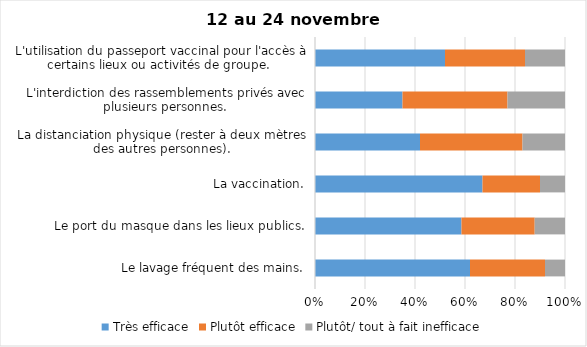
| Category | Très efficace | Plutôt efficace | Plutôt/ tout à fait inefficace |
|---|---|---|---|
| Le lavage fréquent des mains. | 62 | 30 | 8 |
| Le port du masque dans les lieux publics. | 58 | 29 | 12 |
| La vaccination. | 67 | 23 | 10 |
| La distanciation physique (rester à deux mètres des autres personnes). | 42 | 41 | 17 |
| L'interdiction des rassemblements privés avec plusieurs personnes. | 35 | 42 | 23 |
| L'utilisation du passeport vaccinal pour l'accès à certains lieux ou activités de groupe.  | 52 | 32 | 16 |